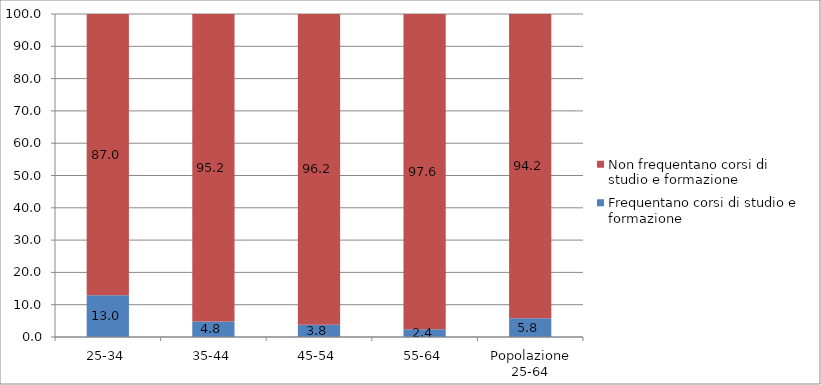
| Category | Frequentano corsi di studio e formazione | Non frequentano corsi di studio e formazione |
|---|---|---|
| 25-34 | 12.958 | 87.042 |
| 35-44 | 4.81 | 95.19 |
| 45-54 | 3.807 | 96.193 |
| 55-64 | 2.438 | 97.562 |
| Popolazione 25-64 | 5.828 | 94.172 |